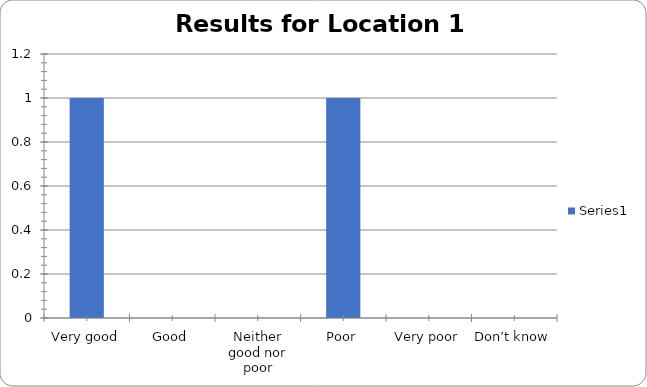
| Category | Series 0 |
|---|---|
| Very good | 1 |
| Good | 0 |
| Neither good nor poor | 0 |
| Poor | 1 |
| Very poor | 0 |
| Don’t know | 0 |